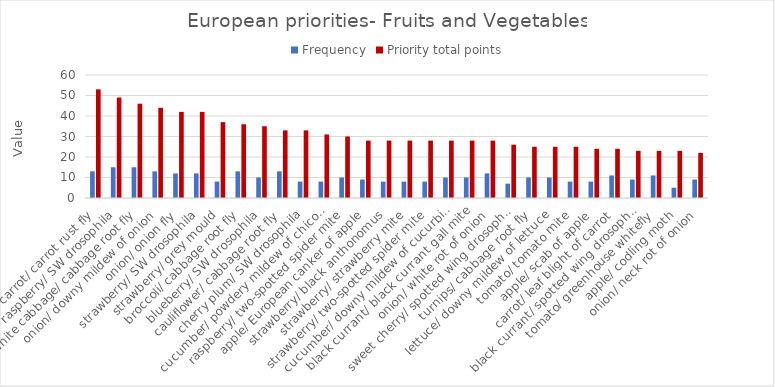
| Category | Frequency | Priority total points |
|---|---|---|
| carrot/ carrot rust fly | 13 | 53 |
| raspberry/ SW drosophila | 15 | 49 |
| white cabbage/ cabbage root fly | 15 | 46 |
| onion/ downy mildew of onion | 13 | 44 |
| onion/ onion fly | 12 | 42 |
| strawberry/ SW drosophila | 12 | 42 |
| strawberry/ grey mould | 8 | 37 |
| broccoli/ cabbage root fly | 13 | 36 |
| blueberry/ SW drosophila | 10 | 35 |
| cauliflower/ cabbage root fly | 13 | 33 |
| cherry plum/ SW drosophila | 8 | 33 |
| cucumber/ powdery mildew of chicory | 8 | 31 |
| raspberry/ two-spotted spider mite | 10 | 30 |
| apple/ European canker of apple | 9 | 28 |
| strawberry/ black anthonomus | 8 | 28 |
| strawberry/ strawberry mite | 8 | 28 |
| strawberry/ two-spotted spider mite | 8 | 28 |
| cucumber/ downy mildew of cucurbits | 10 | 28 |
| black currant/ black currant gall mite | 10 | 28 |
| onion/ white rot of onion | 12 | 28 |
| sweet cherry/ spotted wing drosophila | 7 | 26 |
| turnips/ cabbage root fly | 10 | 25 |
| lettuce/ downy mildew of lettuce | 10 | 25 |
| tomato/ tomato mite | 8 | 25 |
| apple/ scab of apple | 8 | 24 |
| carrot/ leaf blight of carrot | 11 | 24 |
| black currant/ spotted wing drosophila | 9 | 23 |
| tomato/ greenhouse whitefly | 11 | 23 |
| apple/ codling moth | 5 | 23 |
| onion/ neck rot of onion | 9 | 22 |